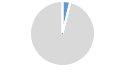
| Category | Series 0 |
|---|---|
| 0 | 0.038 |
| 1 | 0.962 |